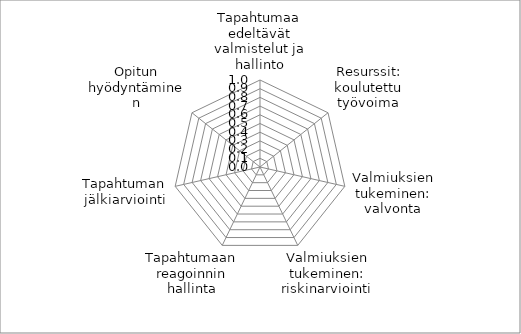
| Category | Series 0 |
|---|---|
| Tapahtumaa edeltävät valmistelut ja hallinto | 0 |
| Resurssit: koulutettu työvoima | 0 |
| Valmiuksien tukeminen: valvonta | 0 |
| Valmiuksien tukeminen: riskinarviointi | 0 |
| Tapahtumaan reagoinnin hallinta | 0 |
| Tapahtuman jälkiarviointi | 0 |
| Opitun hyödyntäminen | 0 |